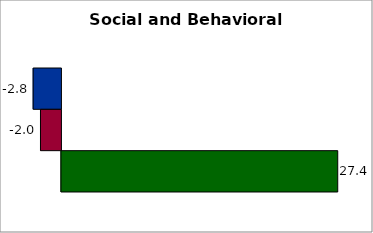
| Category | 50 states and D.C. | SREB states | State |
|---|---|---|---|
| 0 | -2.754 | -2.027 | 27.397 |